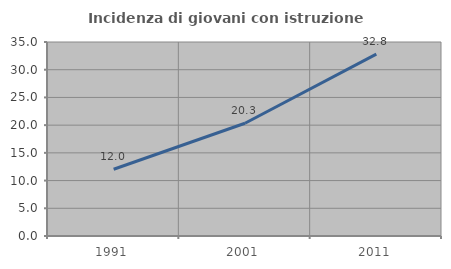
| Category | Incidenza di giovani con istruzione universitaria |
|---|---|
| 1991.0 | 12.04 |
| 2001.0 | 20.336 |
| 2011.0 | 32.8 |